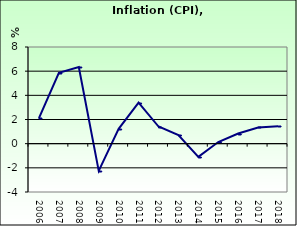
| Category | Inflation (CPI) |
|---|---|
| 2006.0 | 2.114 |
| 2007.0 | 5.863 |
| 2008.0 | 6.335 |
| 2009.0 | -2.248 |
| 2010.0 | 1.229 |
| 2011.0 | 3.403 |
| 2012.0 | 1.418 |
| 2013.0 | 0.71 |
| 2014.0 | -1.09 |
| 2015.0 | 0.135 |
| 2016.0 | 0.837 |
| 2017.0 | 1.338 |
| 2018.0 | 1.433 |